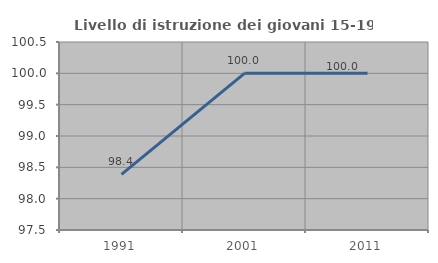
| Category | Livello di istruzione dei giovani 15-19 anni |
|---|---|
| 1991.0 | 98.387 |
| 2001.0 | 100 |
| 2011.0 | 100 |